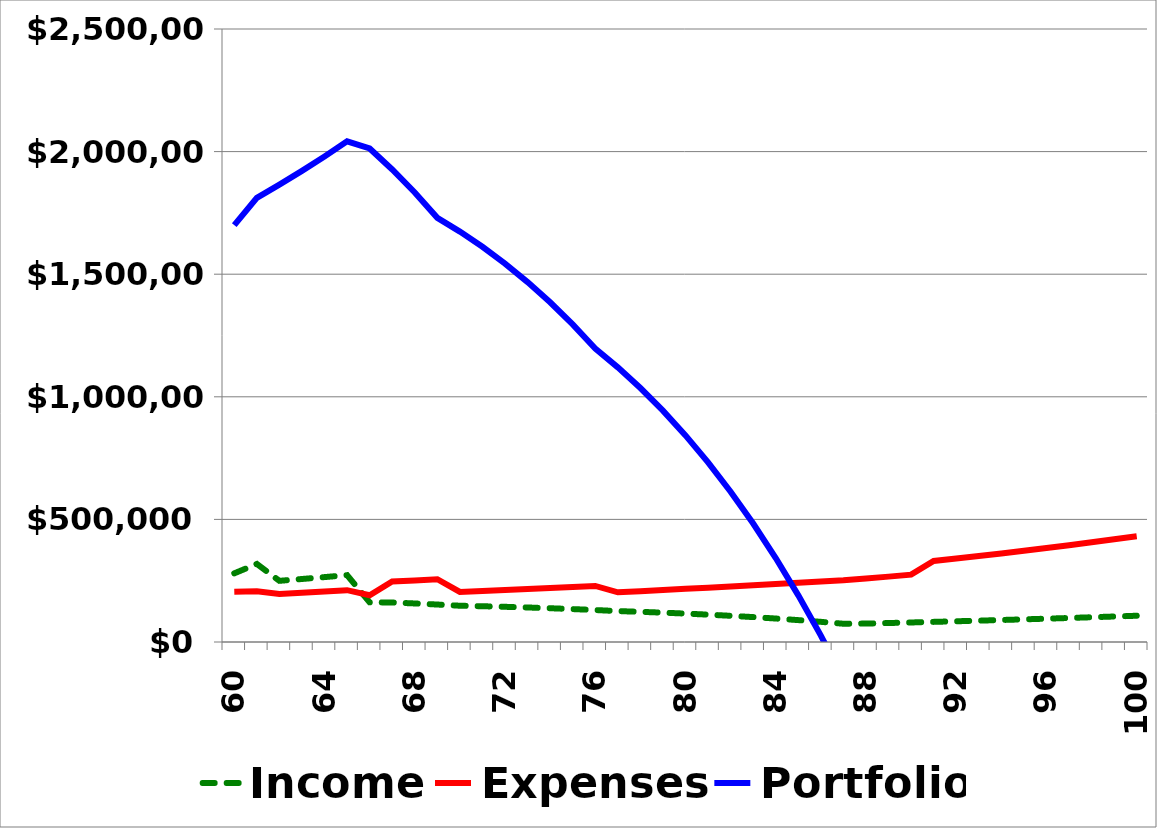
| Category | Income | Expenses | Portfolio |
|---|---|---|---|
| 60.0 | 280000 | 205000 | 1700000 |
| 61.0 | 318300 | 207176 | 1811124 |
| 62.0 | 249475.44 | 195429.097 | 1865170.343 |
| 63.0 | 256942.461 | 200568.176 | 1921544.627 |
| 64.0 | 264675.885 | 205870.755 | 1980349.758 |
| 65.0 | 272685.689 | 211342.173 | 2041693.273 |
| 66.0 | 161695.965 | 190744.974 | 2012644.265 |
| 67.0 | 161128.856 | 246548.808 | 1927224.312 |
| 68.0 | 157214.765 | 251300.722 | 1833138.356 |
| 69.0 | 152817.047 | 256114.628 | 1729840.774 |
| 70.0 | 147904.054 | 203983.962 | 1673760.866 |
| 71.0 | 145862.668 | 207958.209 | 1611665.325 |
| 72.0 | 143500.046 | 211994.485 | 1543170.885 |
| 73.0 | 140794.383 | 216091.974 | 1467873.295 |
| 74.0 | 137722.652 | 220249.709 | 1385346.238 |
| 75.0 | 134260.536 | 224466.565 | 1295140.208 |
| 76.0 | 130382.367 | 228741.245 | 1196781.33 |
| 77.0 | 126061.053 | 202795.023 | 1120047.36 |
| 78.0 | 123084.64 | 207392.06 | 1035739.94 |
| 79.0 | 119702.649 | 212057.425 | 943385.164 |
| 80.0 | 115888.11 | 216789.911 | 842483.362 |
| 81.0 | 111612.551 | 221588.124 | 732507.789 |
| 82.0 | 106845.924 | 226450.467 | 612903.245 |
| 83.0 | 101556.515 | 231375.128 | 483084.632 |
| 84.0 | 95710.867 | 236360.067 | 342435.433 |
| 85.0 | 89273.689 | 241402.998 | 190306.124 |
| 86.0 | 82207.758 | 246501.376 | 26012.506 |
| 87.0 | 74473.822 | 251652.381 | -151166.053 |
| 88.0 | 75100.464 | 258848.286 | -334913.875 |
| 89.0 | 77353.478 | 266613.735 | -524174.132 |
| 90.0 | 79674.082 | 274612.147 | -719112.196 |
| 91.0 | 82064.305 | 330562.583 | -967610.475 |
| 92.0 | 84526.234 | 340479.461 | -1223563.702 |
| 93.0 | 87062.021 | 350693.845 | -1487195.525 |
| 94.0 | 89673.881 | 361214.66 | -1758736.304 |
| 95.0 | 92364.098 | 372051.1 | -2038423.306 |
| 96.0 | 95135.021 | 383212.633 | -2326500.918 |
| 97.0 | 97989.071 | 394709.012 | -2623220.858 |
| 98.0 | 100928.744 | 406550.282 | -2928842.397 |
| 99.0 | 103956.606 | 418746.791 | -3243632.581 |
| 100.0 | 107075.304 | 431309.194 | -3567866.471 |